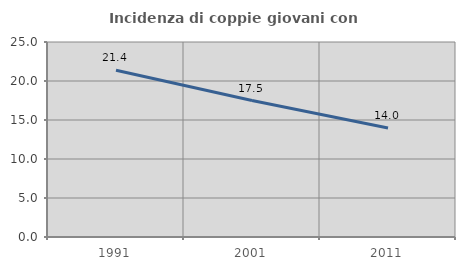
| Category | Incidenza di coppie giovani con figli |
|---|---|
| 1991.0 | 21.387 |
| 2001.0 | 17.489 |
| 2011.0 | 13.983 |